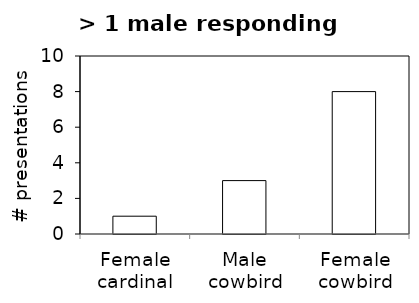
| Category | Series 0 |
|---|---|
| Female cardinal | 1 |
| Male cowbird | 3 |
| Female cowbird | 8 |